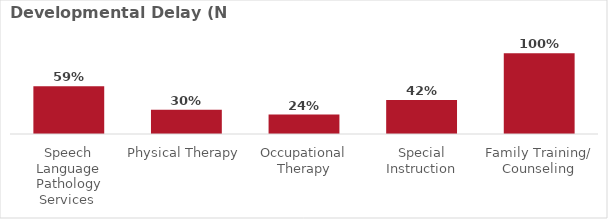
| Category | Developmental Delay (N = ) |
|---|---|
| Speech Language Pathology Services  | 0.59 |
| Physical Therapy | 0.3 |
| Occupational Therapy | 0.24 |
| Special Instruction | 0.42 |
| Family Training/ Counseling | 1 |